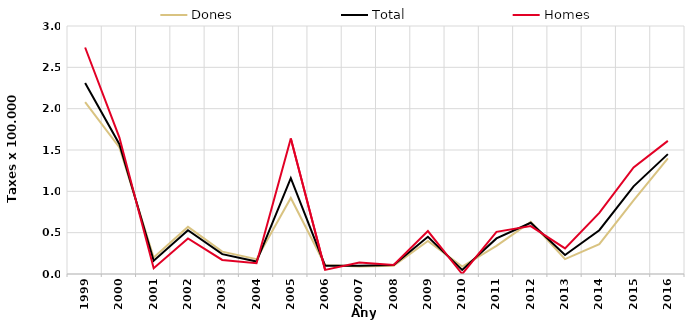
| Category | Dones | Total | Homes |
|---|---|---|---|
| 1999.0 | 2.08 | 2.31 | 2.74 |
| 2000.0 | 1.53 | 1.57 | 1.65 |
| 2001.0 | 0.2 | 0.16 | 0.07 |
| 2002.0 | 0.57 | 0.53 | 0.43 |
| 2003.0 | 0.27 | 0.24 | 0.17 |
| 2004.0 | 0.18 | 0.15 | 0.13 |
| 2005.0 | 0.92 | 1.16 | 1.64 |
| 2006.0 | 0.11 | 0.1 | 0.05 |
| 2007.0 | 0.09 | 0.1 | 0.14 |
| 2008.0 | 0.1 | 0.11 | 0.11 |
| 2009.0 | 0.4 | 0.45 | 0.52 |
| 2010.0 | 0.09 | 0.05 | 0 |
| 2011.0 | 0.34 | 0.43 | 0.51 |
| 2012.0 | 0.63 | 0.62 | 0.58 |
| 2013.0 | 0.18 | 0.23 | 0.31 |
| 2014.0 | 0.36 | 0.53 | 0.74 |
| 2015.0 | 0.89 | 1.06 | 1.29 |
| 2016.0 | 1.4 | 1.45 | 1.61 |